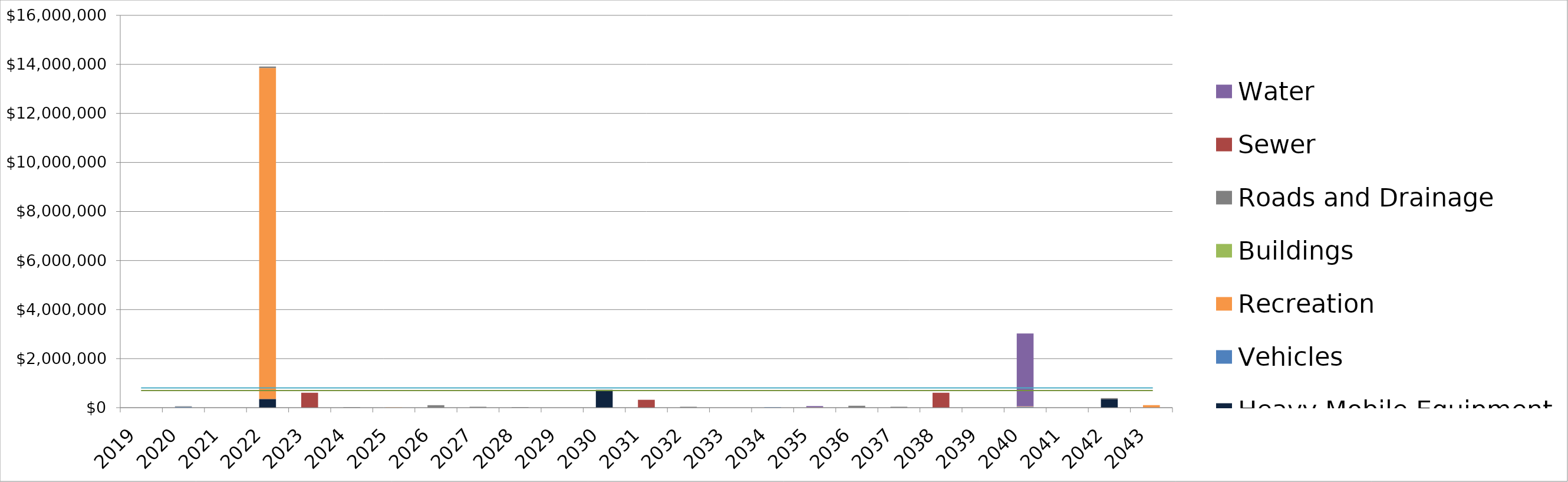
| Category | Heavy Mobile Equipment | Vehicles  | Recreation | Buildings | Roads and Drainage | Sewer | Water |
|---|---|---|---|---|---|---|---|
| 2019.0 | 0 | 0 | 0 | 0 | 0 | 0 | 0 |
| 2020.0 | 0 | 35000 | 0 | 0 | 23040.316 | 0 | 0 |
| 2021.0 | 0 | 0 | 0 | 0 | 0 | 0 | 0 |
| 2022.0 | 352500 | 0 | 13500000 | 0 | 59856.928 | 0 | 0 |
| 2023.0 | 0 | 0 | 0 | 0 | 0 | 608472.972 | 0 |
| 2024.0 | 0 | 0 | 0 | 0 | 23040.316 | 0 | 0 |
| 2025.0 | 0 | 0 | 10839.387 | 0 | 0 | 0 | 0 |
| 2026.0 | 0 | 0 | 0 | 0 | 100941.029 | 0 | 0 |
| 2027.0 | 0 | 0 | 0 | 0 | 36816.611 | 0 | 0 |
| 2028.0 | 0 | 0 | 0 | 0 | 23040.316 | 0 | 0 |
| 2029.0 | 0 | 0 | 0 | 0 | 0 | 0 | 0 |
| 2030.0 | 675000 | 35000 | 0 | 0 | 23040.316 | 0 | 0 |
| 2031.0 | 0 | 0 | 0 | 0 | 0 | 321038.98 | 0 |
| 2032.0 | 0 | 0 | 0 | 0 | 36816.611 | 0 | 0 |
| 2033.0 | 0 | 0 | 0 | 0 | 0 | 0 | 0 |
| 2034.0 | 0 | 18525 | 0 | 0 | 0 | 0 | 0 |
| 2035.0 | 0 | 0 | 10839.387 | 0 | 0 | 0 | 53755.17 |
| 2036.0 | 0 | 0 | 0 | 0 | 77900.713 | 0 | 0 |
| 2037.0 | 0 | 0 | 0 | 0 | 36816.611 | 0 | 0 |
| 2038.0 | 0 | 0 | 0 | 0 | 0 | 608472.972 | 0 |
| 2039.0 | 0 | 0 | 0 | 0 | 0 | 0 | 0 |
| 2040.0 | 0 | 35000 | 18087.765 | 0 | 0 | 0 | 2969951.273 |
| 2041.0 | 0 | 0 | 0 | 0 | 0 | 0 | 0 |
| 2042.0 | 352500 | 0 | 0 | 0 | 36816.611 | 0 | 0 |
| 2043.0 | 0 | 0 | 102977.674 | 0 | 0 | 0 | 0 |